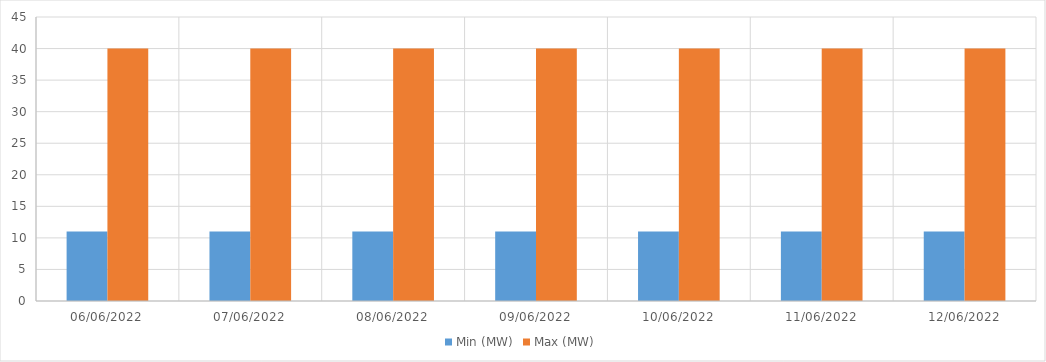
| Category | Min (MW) | Max (MW) |
|---|---|---|
| 06/06/2022 | 11 | 40 |
| 07/06/2022 | 11 | 40 |
| 08/06/2022 | 11 | 40 |
| 09/06/2022 | 11 | 40 |
| 10/06/2022 | 11 | 40 |
| 11/06/2022 | 11 | 40 |
| 12/06/2022 | 11 | 40 |